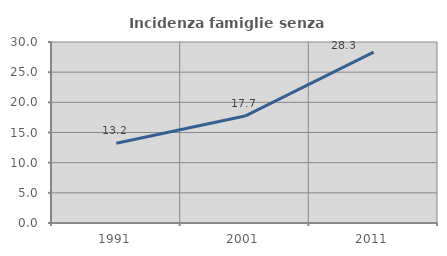
| Category | Incidenza famiglie senza nuclei |
|---|---|
| 1991.0 | 13.233 |
| 2001.0 | 17.728 |
| 2011.0 | 28.314 |